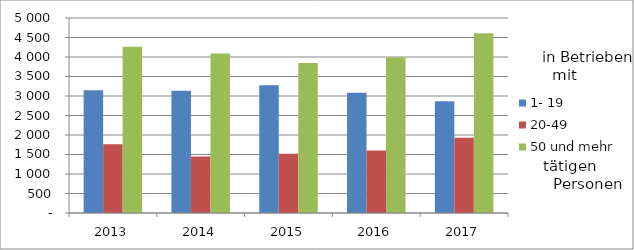
| Category | 1- 19 | 20-49 | 50 und mehr |
|---|---|---|---|
| 2013.0 | 3148 | 1760 | 4264 |
| 2014.0 | 3136 | 1450 | 4090 |
| 2015.0 | 3275 | 1522 | 3844 |
| 2016.0 | 3086 | 1603 | 3988 |
| 2017.0 | 2864 | 1931 | 4609 |